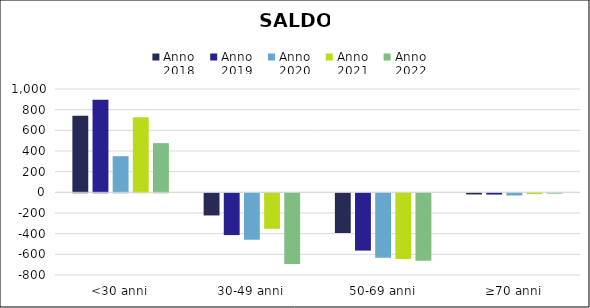
| Category | Anno
2018 | Anno
2019 | Anno
2020 | Anno
2021 | Anno
2022 |
|---|---|---|---|---|---|
| <30 anni | 741 | 896 | 350 | 727 | 476 |
| 30-49 anni | -214 | -404 | -449 | -343 | -684 |
| 50-69 anni | -384 | -554 | -623 | -635 | -653 |
| ≥70 anni | -11 | -12 | -21 | -8 | -3 |